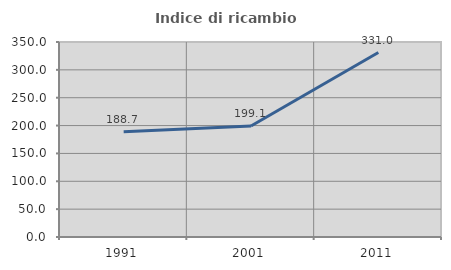
| Category | Indice di ricambio occupazionale  |
|---|---|
| 1991.0 | 188.732 |
| 2001.0 | 199.148 |
| 2011.0 | 331.032 |